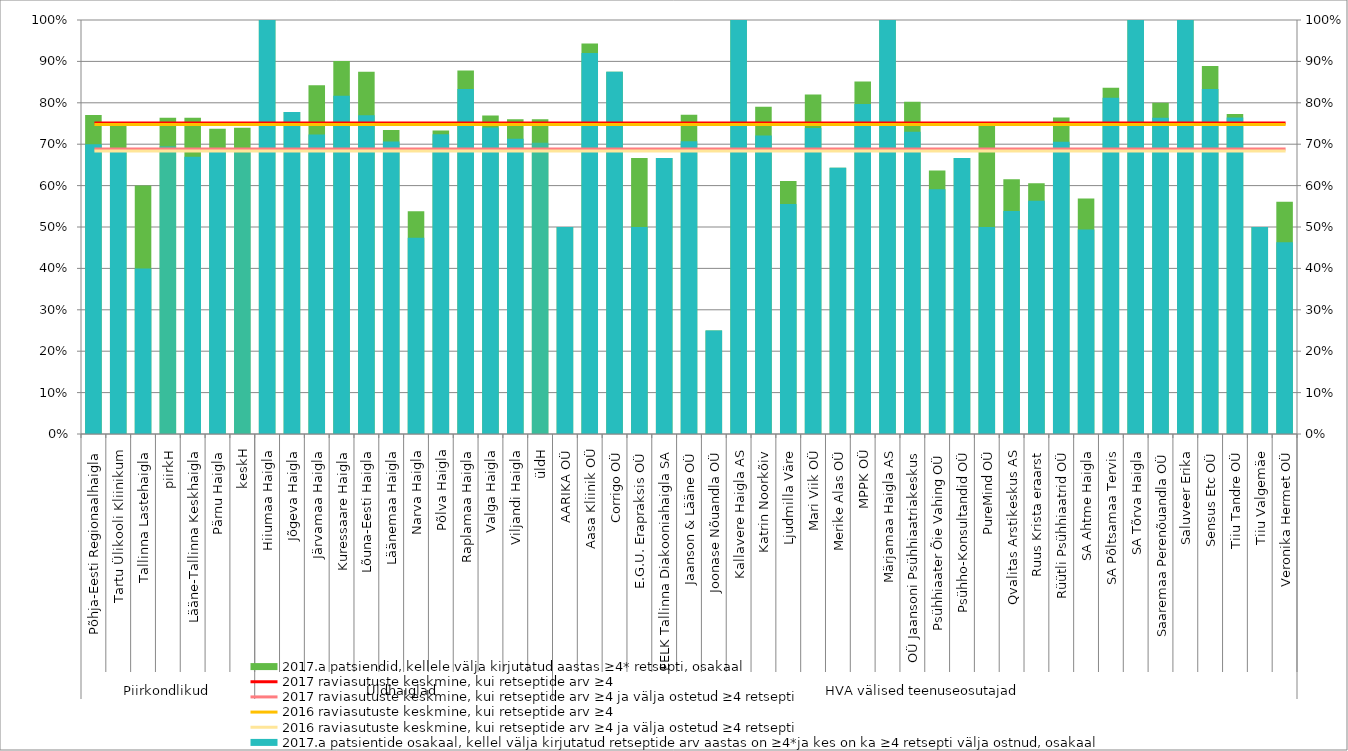
| Category | 2017.a patsiendid, kellele välja kirjutatud aastas ≥4* retsepti, osakaal |
|---|---|
| 0 | 0.771 |
| 1 | 0.745 |
| 2 | 0.6 |
| 3 | 0.764 |
| 4 | 0.764 |
| 5 | 0.737 |
| 6 | 0.74 |
| 7 | 1 |
| 8 | 0.778 |
| 9 | 0.842 |
| 10 | 0.901 |
| 11 | 0.875 |
| 12 | 0.734 |
| 13 | 0.538 |
| 14 | 0.733 |
| 15 | 0.878 |
| 16 | 0.769 |
| 17 | 0.76 |
| 18 | 0.76 |
| 19 | 0.5 |
| 20 | 0.943 |
| 21 | 0.875 |
| 22 | 0.667 |
| 23 | 0.667 |
| 24 | 0.771 |
| 25 | 0.25 |
| 26 | 1 |
| 27 | 0.791 |
| 28 | 0.611 |
| 29 | 0.82 |
| 30 | 0.643 |
| 31 | 0.851 |
| 32 | 1 |
| 33 | 0.803 |
| 34 | 0.636 |
| 35 | 0.667 |
| 36 | 0.75 |
| 37 | 0.615 |
| 38 | 0.606 |
| 39 | 0.765 |
| 40 | 0.569 |
| 41 | 0.836 |
| 42 | 1 |
| 43 | 0.8 |
| 44 | 1 |
| 45 | 0.889 |
| 46 | 0.773 |
| 47 | 0.5 |
| 48 | 0.561 |